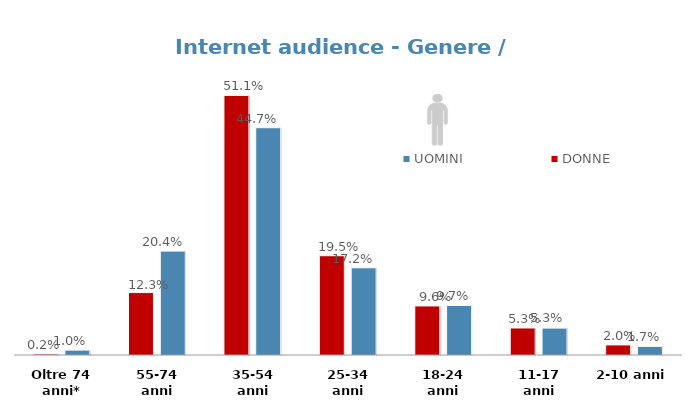
| Category | UOMINI | DONNE |
|---|---|---|
| 2-10 anni | 0.017 | 0.02 |
| 11-17 anni | 0.053 | 0.053 |
| 18-24 anni | 0.097 | 0.096 |
| 25-34 anni | 0.172 | 0.195 |
| 35-54 anni | 0.447 | 0.511 |
| 55-74 anni | 0.204 | 0.123 |
| Oltre 74 anni* | 0.01 | 0.002 |